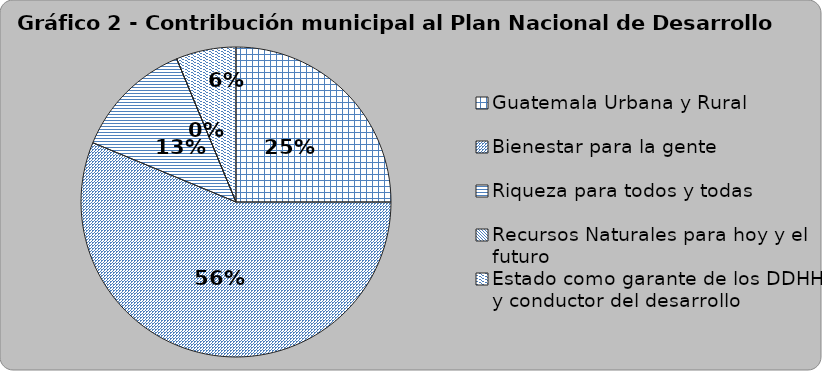
| Category | Series 0 |
|---|---|
| Guatemala Urbana y Rural | 4 |
| Bienestar para la gente | 9 |
| Riqueza para todos y todas | 2 |
| Recursos Naturales para hoy y el futuro | 0 |
| Estado como garante de los DDHH y conductor del desarrollo | 1 |